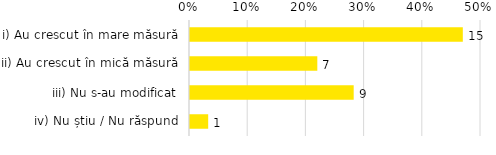
| Category | Total |
|---|---|
| i) Au crescut în mare măsură | 0.469 |
| ii) Au crescut în mică măsură | 0.219 |
| iii) Nu s-au modificat | 0.281 |
| iv) Nu știu / Nu răspund | 0.031 |